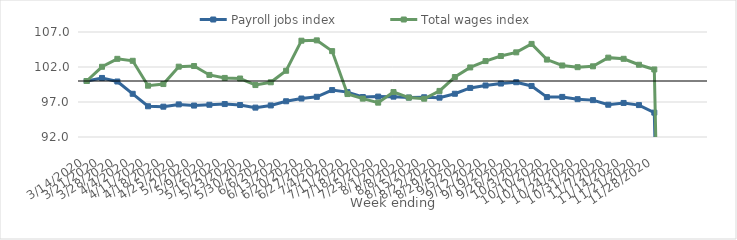
| Category | Payroll jobs index | Total wages index |
|---|---|---|
| 14/03/2020 | 100 | 100 |
| 21/03/2020 | 100.436 | 102.03 |
| 28/03/2020 | 99.927 | 103.166 |
| 04/04/2020 | 98.171 | 102.886 |
| 11/04/2020 | 96.389 | 99.33 |
| 18/04/2020 | 96.33 | 99.564 |
| 25/04/2020 | 96.657 | 102.046 |
| 02/05/2020 | 96.49 | 102.14 |
| 09/05/2020 | 96.603 | 100.867 |
| 16/05/2020 | 96.707 | 100.438 |
| 23/05/2020 | 96.571 | 100.354 |
| 30/05/2020 | 96.197 | 99.42 |
| 06/06/2020 | 96.51 | 99.818 |
| 13/06/2020 | 97.106 | 101.461 |
| 20/06/2020 | 97.497 | 105.758 |
| 27/06/2020 | 97.739 | 105.804 |
| 04/07/2020 | 98.704 | 104.269 |
| 11/07/2020 | 98.41 | 98.136 |
| 18/07/2020 | 97.711 | 97.478 |
| 25/07/2020 | 97.771 | 96.907 |
| 01/08/2020 | 97.765 | 98.422 |
| 08/08/2020 | 97.639 | 97.626 |
| 15/08/2020 | 97.676 | 97.47 |
| 22/08/2020 | 97.622 | 98.584 |
| 29/08/2020 | 98.176 | 100.568 |
| 05/09/2020 | 99.01 | 101.938 |
| 12/09/2020 | 99.361 | 102.844 |
| 19/09/2020 | 99.636 | 103.571 |
| 26/09/2020 | 99.826 | 104.093 |
| 03/10/2020 | 99.29 | 105.298 |
| 10/10/2020 | 97.701 | 103.06 |
| 17/10/2020 | 97.726 | 102.218 |
| 24/10/2020 | 97.403 | 101.975 |
| 31/10/2020 | 97.268 | 102.096 |
| 07/11/2020 | 96.607 | 103.335 |
| 14/11/2020 | 96.865 | 103.17 |
| 21/11/2020 | 96.56 | 102.321 |
| 28/11/2020 | 95.479 | 101.648 |